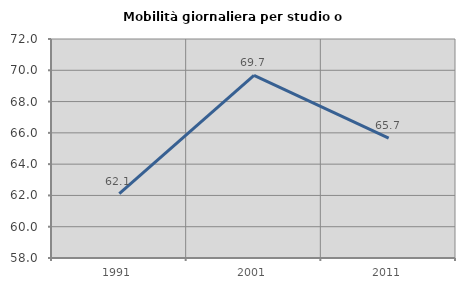
| Category | Mobilità giornaliera per studio o lavoro |
|---|---|
| 1991.0 | 62.11 |
| 2001.0 | 69.675 |
| 2011.0 | 65.664 |